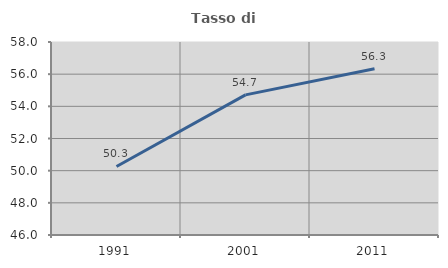
| Category | Tasso di occupazione   |
|---|---|
| 1991.0 | 50.26 |
| 2001.0 | 54.714 |
| 2011.0 | 56.335 |